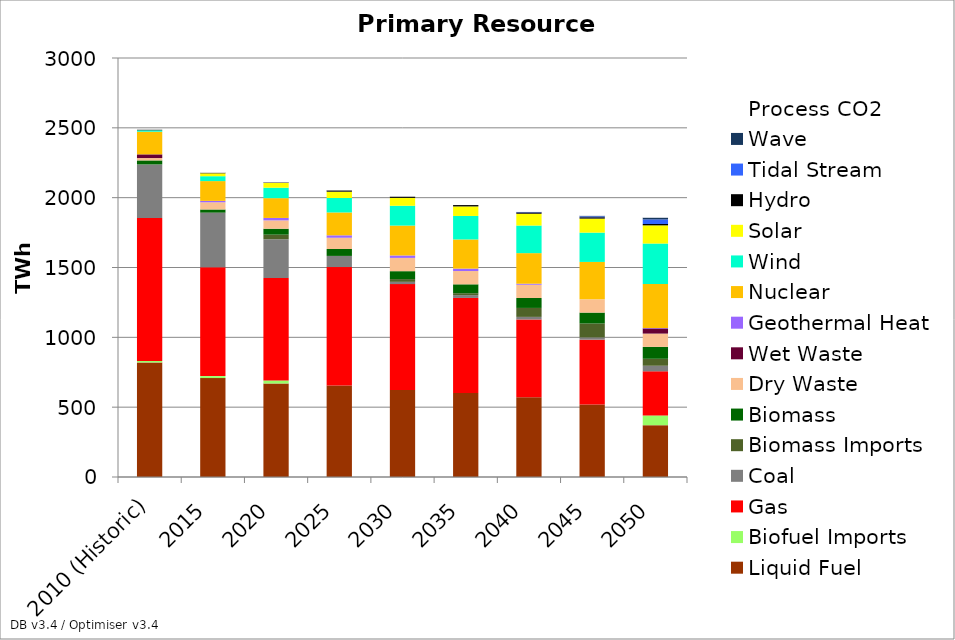
| Category | Liquid Fuel | Biofuel Imports | Gas | Coal | Biomass Imports | Biomass | Dry Waste | Wet Waste | Geothermal Heat | Nuclear | Wind | Solar | Hydro | Tidal Stream | Wave | Process CO2 |
|---|---|---|---|---|---|---|---|---|---|---|---|---|---|---|---|---|
| 2010 (Historic) | 820.3 | 10.6 | 1023.8 | 383.1 | 0 | 28.9 | 17 | 26.4 | 0 | 162.2 | 10.2 | 0 | 3.6 | 0 | 0 | 0 |
| 2015 | 708.389 | 14 | 779.907 | 390.703 | 0 | 22.385 | 51.566 | 0 | 10.047 | 141.642 | 35.068 | 20.609 | 4.941 | 0 | 0 | 38.745 |
| 2020 | 669.548 | 22 | 733.726 | 277.346 | 32.66 | 42.33 | 59.839 | 0 | 17.415 | 141.642 | 74.849 | 33.465 | 4.681 | 0 | 0 | 34.486 |
| 2025 | 655.119 | 0 | 848.084 | 79.791 | 0 | 49.468 | 80.619 | 0 | 17.334 | 163.75 | 103.521 | 45.138 | 9.798 | 0 | 0 | 30.716 |
| 2030 | 623.399 | 0 | 757.607 | 16.295 | 19.722 | 56.607 | 95.145 | 0 | 17.415 | 213.896 | 141.886 | 56.687 | 9.798 | 0 | 0 | 28.44 |
| 2035 | 601.705 | 0 | 680.347 | 20.128 | 13.611 | 63.745 | 95.145 | 0 | 17.415 | 208.662 | 168.339 | 68.31 | 9.798 | 0 | 0 | 27.952 |
| 2040 | 570.551 | 0 | 557.172 | 18.652 | 64.192 | 70.884 | 95.145 | 0 | 7.368 | 218.84 | 197.638 | 84.581 | 9.798 | 3.886 | 0 | 27.542 |
| 2045 | 518.447 | 0 | 464.615 | 16.065 | 100 | 78.022 | 95.145 | 0 | 0 | 267.575 | 209.952 | 100.302 | 9.798 | 6.263 | 4.936 | 27.153 |
| 2050 | 370.884 | 70 | 315.716 | 39.897 | 50 | 85.161 | 95.145 | 37.04 | 2.914 | 315.932 | 288.878 | 130.218 | 9.798 | 32.645 | 13.518 | 26.766 |